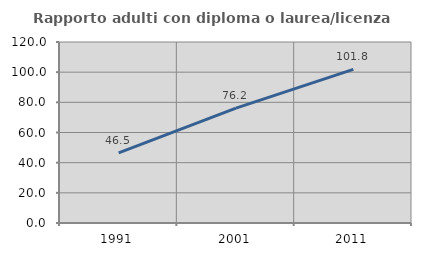
| Category | Rapporto adulti con diploma o laurea/licenza media  |
|---|---|
| 1991.0 | 46.474 |
| 2001.0 | 76.166 |
| 2011.0 | 101.832 |